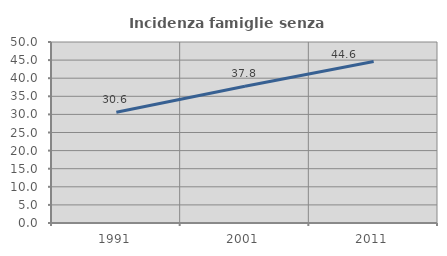
| Category | Incidenza famiglie senza nuclei |
|---|---|
| 1991.0 | 30.603 |
| 2001.0 | 37.759 |
| 2011.0 | 44.628 |